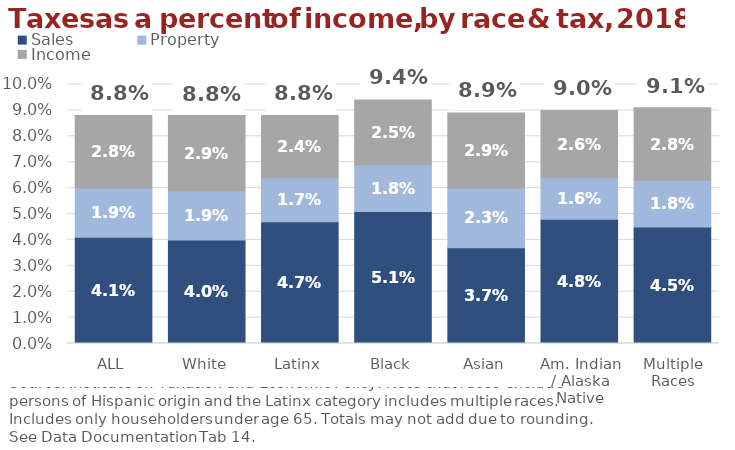
| Category | Sales | Property | Income |
|---|---|---|---|
| ALL | 0.041 | 0.019 | 0.028 |
| White | 0.04 | 0.019 | 0.029 |
| Latinx | 0.047 | 0.017 | 0.024 |
| Black | 0.051 | 0.018 | 0.025 |
| Asian | 0.037 | 0.023 | 0.029 |
| Am. Indian / Alaska Native | 0.048 | 0.016 | 0.026 |
| Multiple Races | 0.045 | 0.018 | 0.028 |